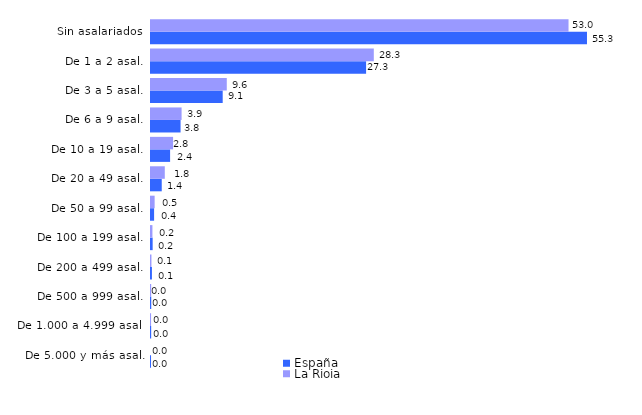
| Category | España | La Rioja |
|---|---|---|
| De 5.000 y más asal. | 0.004 | 0 |
| De 1.000 a 4.999 asal. | 0.022 | 0.009 |
| De 500 a 999 asal. | 0.031 | 0.022 |
| De 200 a 499 asal. | 0.118 | 0.056 |
| De 100 a 199 asal. | 0.211 | 0.181 |
| De 50 a 99 asal. | 0.393 | 0.461 |
| De 20 a 49 asal. | 1.363 | 1.75 |
| De 10 a 19 asal. | 2.423 | 2.802 |
| De 6 a 9 asal. | 3.75 | 3.88 |
| De 3 a 5 asal. | 9.095 | 9.613 |
| De 1 a 2 asal. | 27.285 | 28.262 |
| Sin asalariados | 55.305 | 52.964 |